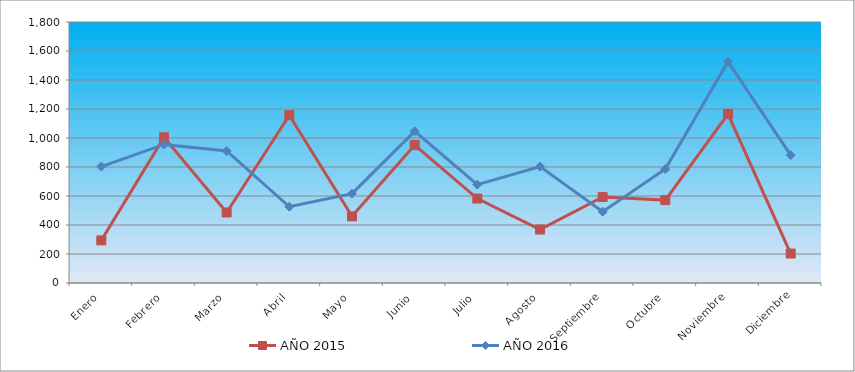
| Category | AÑO 2015 | AÑO 2016 |
|---|---|---|
| Enero | 293.899 | 802.943 |
| Febrero | 1004.601 | 955.615 |
| Marzo | 486.27 | 910.379 |
| Abril | 1156.894 | 525.871 |
| Mayo | 459.551 | 616.343 |
| Junio | 951.165 | 1046.087 |
| Julio | 582.455 | 678.543 |
| Agosto | 368.71 | 802.943 |
| Septiembre | 593.142 | 491.944 |
| Octubre | 571.767 | 785.979 |
| Noviembre | 1164.909 | 1526.722 |
| Diciembre | 203.058 | 882.106 |